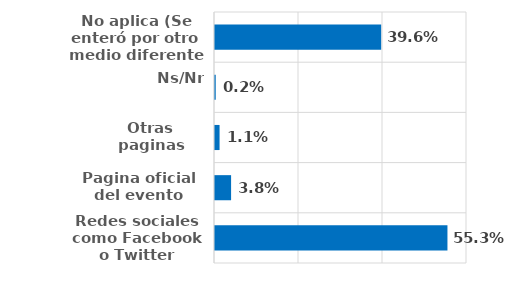
| Category | Series 0 |
|---|---|
| Redes sociales como Facebook o Twitter | 0.553 |
| Pagina oficial del evento | 0.038 |
| Otras paginas | 0.011 |
| Ns/Nr | 0.002 |
| No aplica (Se enteró por otro medio diferente a internet) | 0.396 |